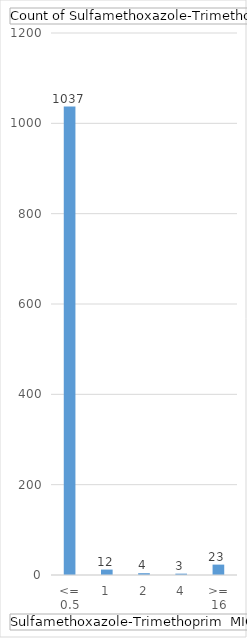
| Category | Total |
|---|---|
| <= 0.5 | 1037 |
| 1 | 12 |
| 2 | 4 |
| 4 | 3 |
| >= 16 | 23 |